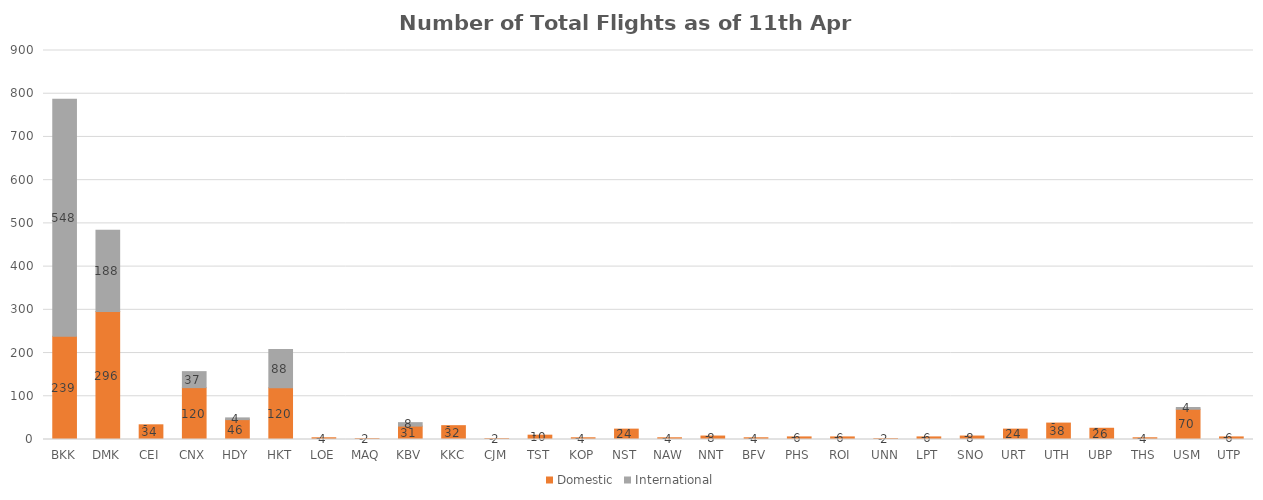
| Category | Domestic | International |
|---|---|---|
| BKK | 239 | 548 |
| DMK | 296 | 188 |
| CEI | 34 | 0 |
| CNX | 120 | 37 |
| HDY | 46 | 4 |
| HKT | 120 | 88 |
| LOE | 4 | 0 |
| MAQ | 2 | 0 |
| KBV | 31 | 8 |
| KKC | 32 | 0 |
| CJM | 2 | 0 |
| TST | 10 | 0 |
| KOP | 4 | 0 |
| NST | 24 | 0 |
| NAW | 4 | 0 |
| NNT | 8 | 0 |
| BFV | 4 | 0 |
| PHS | 6 | 0 |
| ROI | 6 | 0 |
| UNN | 2 | 0 |
| LPT | 6 | 0 |
| SNO | 8 | 0 |
| URT | 24 | 0 |
| UTH | 38 | 0 |
| UBP | 26 | 0 |
| THS | 4 | 0 |
| USM | 70 | 4 |
| UTP | 6 | 0 |